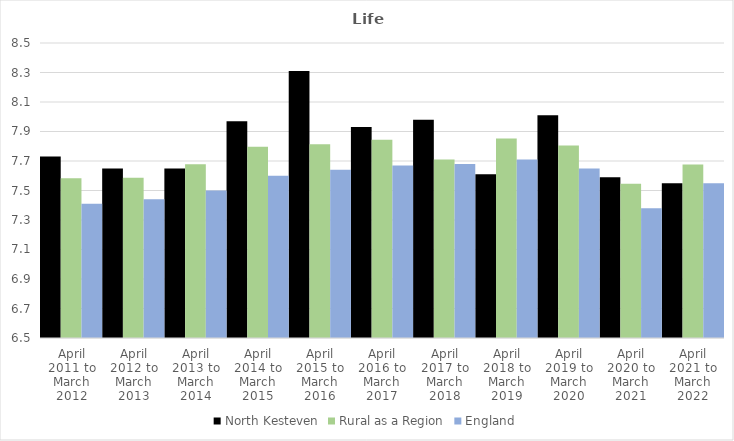
| Category | North Kesteven | Rural as a Region | England |
|---|---|---|---|
| April 2011 to March 2012 | 7.73 | 7.584 | 7.41 |
| April 2012 to March 2013 | 7.65 | 7.586 | 7.44 |
| April 2013 to March 2014 | 7.65 | 7.677 | 7.5 |
| April 2014 to March 2015 | 7.97 | 7.797 | 7.6 |
| April 2015 to March 2016 | 8.31 | 7.813 | 7.64 |
| April 2016 to March 2017 | 7.93 | 7.845 | 7.67 |
| April 2017 to March 2018 | 7.98 | 7.71 | 7.68 |
| April 2018 to March 2019 | 7.61 | 7.852 | 7.71 |
| April 2019 to March 2020 | 8.01 | 7.806 | 7.65 |
| April 2020 to March 2021 | 7.59 | 7.546 | 7.38 |
| April 2021 to March 2022 | 7.55 | 7.677 | 7.55 |